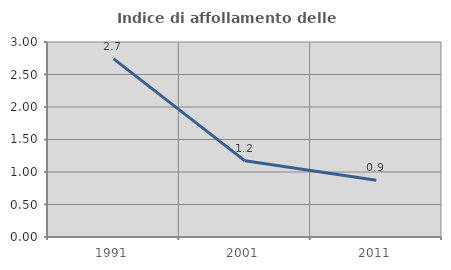
| Category | Indice di affollamento delle abitazioni  |
|---|---|
| 1991.0 | 2.74 |
| 2001.0 | 1.172 |
| 2011.0 | 0.874 |